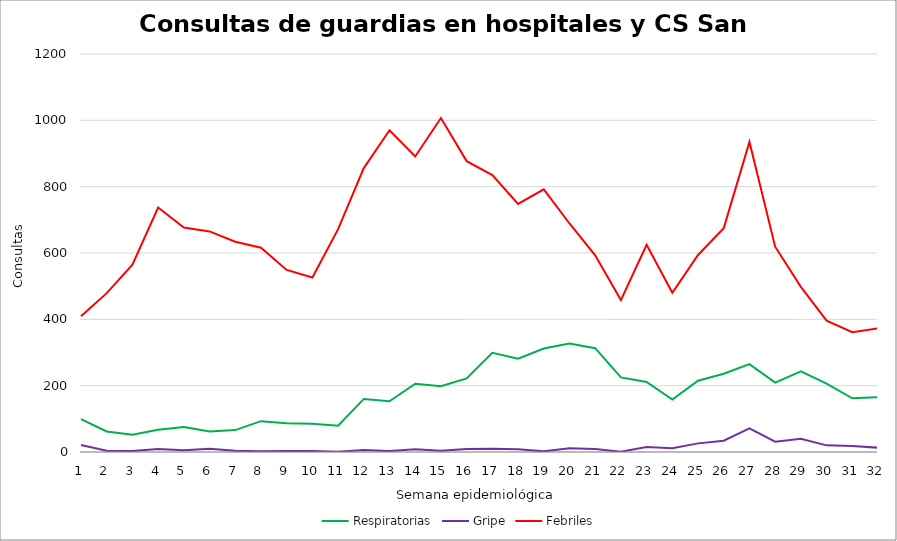
| Category | Respiratorias | Gripe | Febriles |
|---|---|---|---|
| 1.0 | 99 | 21 | 409 |
| 2.0 | 62 | 4 | 479 |
| 3.0 | 52 | 3 | 565 |
| 4.0 | 67 | 9 | 737 |
| 5.0 | 75 | 5 | 677 |
| 6.0 | 62 | 10 | 665 |
| 7.0 | 66 | 4 | 634 |
| 8.0 | 93 | 2 | 616 |
| 9.0 | 87 | 3 | 549 |
| 10.0 | 85 | 3 | 526 |
| 11.0 | 79 | 1 | 672 |
| 12.0 | 160 | 6 | 856 |
| 13.0 | 153 | 3 | 970 |
| 14.0 | 206 | 8 | 891 |
| 15.0 | 198 | 4 | 1007 |
| 16.0 | 222 | 9 | 877 |
| 17.0 | 299 | 10 | 835 |
| 18.0 | 281 | 8 | 748 |
| 19.0 | 312 | 2 | 792 |
| 20.0 | 327 | 11 | 689 |
| 21.0 | 313 | 9 | 593 |
| 22.0 | 225 | 1 | 458 |
| 23.0 | 211 | 15 | 625 |
| 24.0 | 158 | 11 | 480 |
| 25.0 | 215 | 26 | 594 |
| 26.0 | 236 | 34 | 675 |
| 27.0 | 265 | 71 | 935 |
| 28.0 | 209 | 31 | 619 |
| 29.0 | 243 | 40 | 498 |
| 30.0 | 206 | 20 | 396 |
| 31.0 | 162 | 18 | 361 |
| 32.0 | 165 | 13 | 373 |